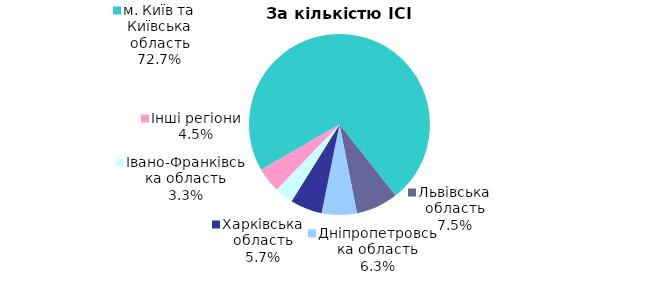
| Category | Series 0 |
|---|---|
| м. Київ та Київська область | 0.727 |
| Львівська область | 0.075 |
| Дніпропетровська область | 0.063 |
| Харківська область | 0.057 |
| Iвано-Франкiвська область | 0.033 |
| Інші регіони | 0.045 |